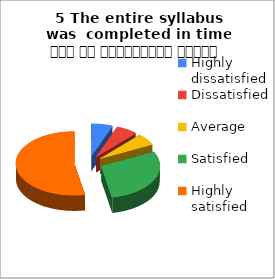
| Category | 5 The entire syllabus was  completed in time समय पर पाठ्यक्रम पूर्ण हुआ |
|---|---|
| Highly dissatisfied | 1 |
| Dissatisfied | 1 |
| Average | 1 |
| Satisfied | 5 |
| Highly satisfied | 9 |